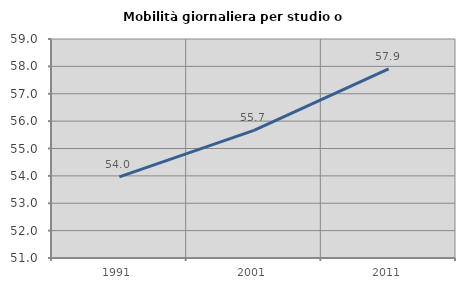
| Category | Mobilità giornaliera per studio o lavoro |
|---|---|
| 1991.0 | 53.965 |
| 2001.0 | 55.663 |
| 2011.0 | 57.905 |